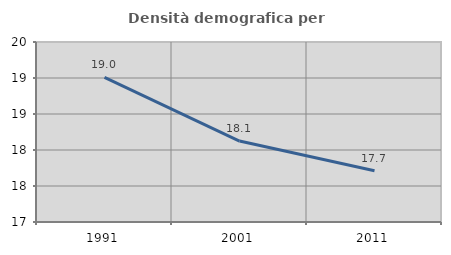
| Category | Densità demografica |
|---|---|
| 1991.0 | 19.009 |
| 2001.0 | 18.124 |
| 2011.0 | 17.713 |